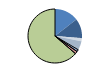
| Category | Series 0 |
|---|---|
| ARRASTRE | 103 |
| CERCO | 83 |
| ATUNEROS CAÑEROS | 1 |
| PALANGRE DE FONDO | 13 |
| PALANGRE DE SUPERFICIE | 35 |
| RASCO | 3 |
| VOLANTA | 9 |
| ARTES FIJAS | 11 |
| ARTES MENORES | 452 |